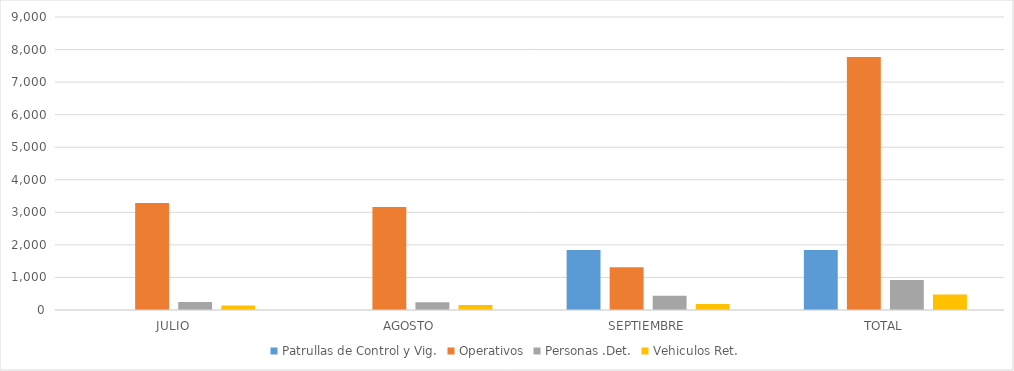
| Category | Patrullas de Control y Vig. | Operativos | Personas .Det. | Vehiculos Ret. |
|---|---|---|---|---|
| JULIO | 0 | 3289 | 243 | 139 |
| AGOSTO | 0 | 3164 | 237 | 153 |
| SEPTIEMBRE | 1842 | 1315 | 441 | 184 |
| TOTAL | 1842 | 7768 | 921 | 476 |